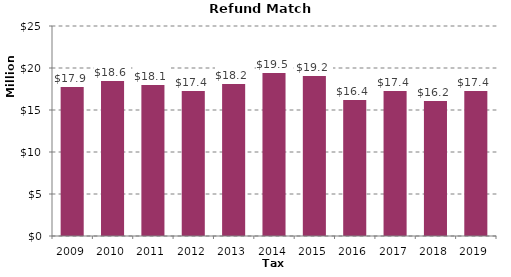
| Category | Total |
|---|---|
| 2009.0 | 17876422.93 |
| 2010.0 | 18578293.82 |
| 2011.0 | 18104923.31 |
| 2012.0 | 17368776.62 |
| 2013.0 | 18211926.47 |
| 2014.0 | 19469019.92 |
| 2015.0 | 19206043.66 |
| 2016.0 | 16359793.29 |
| 2017.0 | 17431562.34 |
| 2018.0 | 16204019.57 |
| 2019.0 | 17428289.38 |